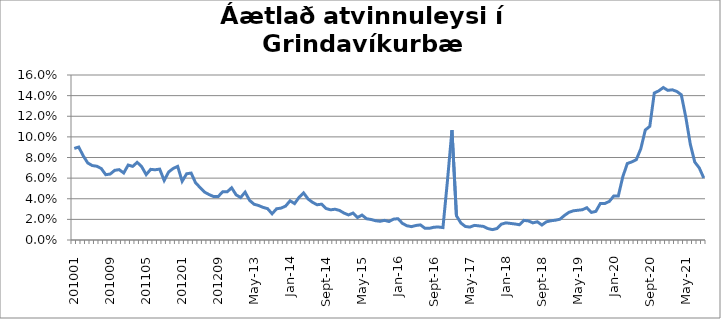
| Category | Series 0 |
|---|---|
| 201001 | 0.089 |
| 201002 | 0.09 |
| 201003 | 0.082 |
| 201004 | 0.075 |
| 201005 | 0.072 |
| 201006 | 0.072 |
| 201007 | 0.069 |
| 201008 | 0.063 |
| 201009 | 0.064 |
| 201010 | 0.068 |
| 201011 | 0.068 |
| 201012 | 0.065 |
| 201101 | 0.073 |
| 201102 | 0.071 |
| 201103 | 0.075 |
| 201104 | 0.071 |
| 201105 | 0.063 |
| 201106 | 0.069 |
| 201107 | 0.068 |
| 201108 | 0.069 |
| 201109 | 0.058 |
| 201110 | 0.066 |
| 201111 | 0.069 |
| 201112 | 0.071 |
| 201201 | 0.057 |
| 201202 | 0.064 |
| 201203 | 0.065 |
| 201204 | 0.055 |
| 201205 | 0.051 |
| 201206 | 0.046 |
| 201207 | 0.044 |
| 201208 | 0.042 |
| 201209 | 0.042 |
| 201210 | 0.047 |
| 201211 | 0.047 |
| 201212 | 0.051 |
| Jan-13 | 0.044 |
| Feb-13 | 0.041 |
| Mar-13 | 0.046 |
| Apr-13 | 0.038 |
| May-13 | 0.035 |
| Jun-13 | 0.033 |
| Jul-13 | 0.032 |
| Aug-13 | 0.03 |
| Sep-13 | 0.025 |
| Oct-13 | 0.03 |
| Nov-13 | 0.031 |
| Dec-13 | 0.033 |
| Jan-14 | 0.038 |
| Feb-14 | 0.035 |
| Mar-14 | 0.041 |
| Apr-14 | 0.046 |
| May-14 | 0.04 |
| Jun-14 | 0.037 |
| Jul-14 | 0.034 |
| Aug-14 | 0.035 |
| Sep-14 | 0.031 |
| Oct-14 | 0.029 |
| Nov-14 | 0.03 |
| Dec-14 | 0.029 |
| Jan-15 | 0.026 |
| Feb-15 | 0.024 |
| Mar-15 | 0.026 |
| Apr-15 | 0.022 |
| May-15 | 0.024 |
| Jun-15 | 0.021 |
| Jul-15 | 0.02 |
| Aug-15 | 0.019 |
| Sep-15 | 0.018 |
| Oct-15 | 0.019 |
| Nov-15 | 0.018 |
| Dec-15 | 0.02 |
| Jan-16 | 0.021 |
| Feb-16 | 0.016 |
| Mar-16 | 0.014 |
| Apr-16 | 0.013 |
| May-16 | 0.014 |
| Jun-16 | 0.015 |
| Jul-16 | 0.011 |
| Aug-16 | 0.011 |
| Sep-16 | 0.012 |
| Oct-16 | 0.013 |
| Nov-16 | 0.012 |
| Dec-16 | 0.058 |
| Jan-17 | 0.106 |
| Feb-17 | 0.023 |
| Mar-17 | 0.016 |
| Apr-17 | 0.013 |
| May-17 | 0.013 |
| Jun-17 | 0.014 |
| Jul-17 | 0.014 |
| Aug-17 | 0.013 |
| Sep-17 | 0.011 |
| Oct-17 | 0.01 |
| Nov-17 | 0.011 |
| Dec-17 | 0.015 |
| Jan-18 | 0.017 |
| Feb-18 | 0.016 |
| Mar-18 | 0.016 |
| Apr-18 | 0.015 |
| May-18 | 0.019 |
| Jun-18 | 0.018 |
| Jul-18 | 0.017 |
| Aug-18 | 0.018 |
| Sep-18 | 0.015 |
| Oct-18 | 0.018 |
| Nov-18 | 0.019 |
| Dec-18 | 0.019 |
| Jan-19 | 0.02 |
| Feb-19 | 0.024 |
| Mar-19 | 0.027 |
| Apr-19 | 0.028 |
| May-19 | 0.029 |
| Jun-19 | 0.029 |
| Jul-19 | 0.031 |
| Aug-19 | 0.027 |
| Sep-19 | 0.028 |
| Oct-19 | 0.035 |
| Nov-19 | 0.035 |
| Dec-19 | 0.037 |
| Jan-20 | 0.043 |
| Feb-20 | 0.043 |
| mars 2020 *** | 0.061 |
| Apr-20 | 0.074 |
| May-20 | 0.076 |
| Jun-20 | 0.078 |
| Jul-20 | 0.088 |
| Aug-20 | 0.107 |
| Sep-20 | 0.11 |
| Oct-20 | 0.142 |
| Nov-20 | 0.145 |
| Dec-20 | 0.148 |
| Jan-21 | 0.145 |
| Feb-21 | 0.146 |
| Mar-21 | 0.144 |
| Apr-21 | 0.141 |
| May-21 | 0.119 |
| Jun-21 | 0.093 |
| Jul-21 | 0.076 |
| Aug-21 | 0.07 |
| Sep-21 | 0.06 |